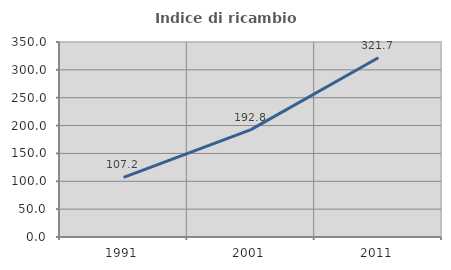
| Category | Indice di ricambio occupazionale  |
|---|---|
| 1991.0 | 107.186 |
| 2001.0 | 192.8 |
| 2011.0 | 321.687 |